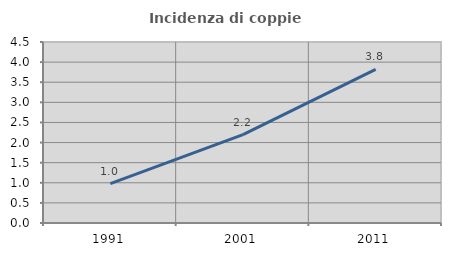
| Category | Incidenza di coppie miste |
|---|---|
| 1991.0 | 0.98 |
| 2001.0 | 2.195 |
| 2011.0 | 3.819 |